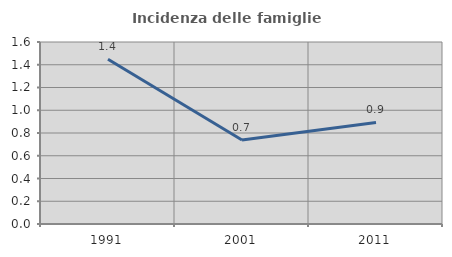
| Category | Incidenza delle famiglie numerose |
|---|---|
| 1991.0 | 1.449 |
| 2001.0 | 0.739 |
| 2011.0 | 0.893 |